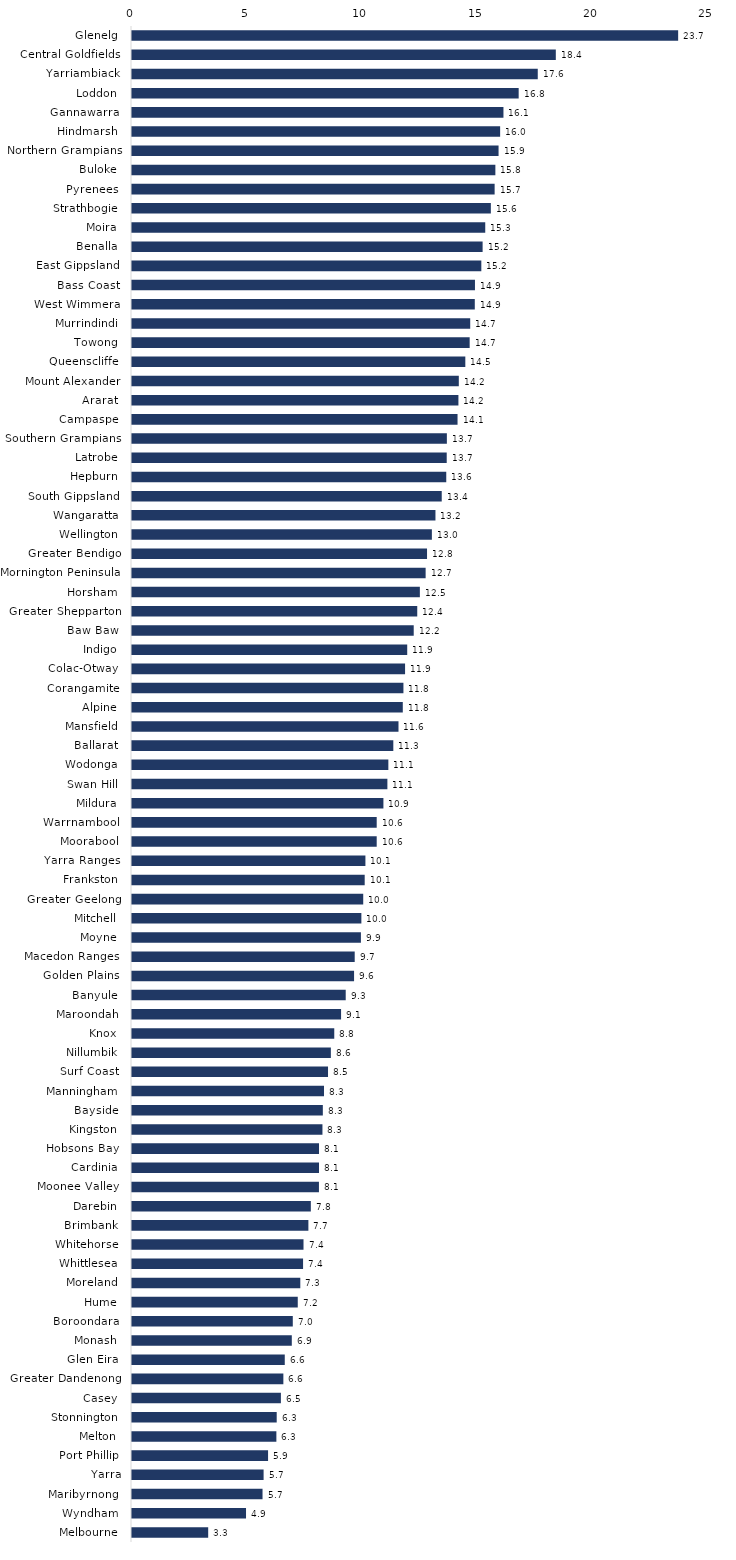
| Category | Series 0 |
|---|---|
| Glenelg  | 23.705 |
| Central Goldfields  | 18.395 |
| Yarriambiack  | 17.611 |
| Loddon  | 16.783 |
| Gannawarra  | 16.122 |
| Hindmarsh  | 15.978 |
| Northern Grampians  | 15.91 |
| Buloke  | 15.771 |
| Pyrenees  | 15.739 |
| Strathbogie  | 15.575 |
| Moira  | 15.332 |
| Benalla  | 15.218 |
| East Gippsland  | 15.162 |
| Bass Coast  | 14.886 |
| West Wimmera  | 14.878 |
| Murrindindi  | 14.68 |
| Towong  | 14.656 |
| Queenscliffe  | 14.467 |
| Mount Alexander  | 14.184 |
| Ararat  | 14.168 |
| Campaspe  | 14.129 |
| Southern Grampians  | 13.666 |
| Latrobe  | 13.66 |
| Hepburn  | 13.64 |
| South Gippsland  | 13.443 |
| Wangaratta  | 13.171 |
| Wellington  | 13.015 |
| Greater Bendigo  | 12.805 |
| Mornington Peninsula  | 12.744 |
| Horsham  | 12.494 |
| Greater Shepparton  | 12.381 |
| Baw Baw  | 12.227 |
| Indigo  | 11.945 |
| Colac-Otway  | 11.852 |
| Corangamite  | 11.781 |
| Alpine  | 11.753 |
| Mansfield  | 11.567 |
| Ballarat  | 11.342 |
| Wodonga  | 11.126 |
| Swan Hill  | 11.085 |
| Mildura  | 10.912 |
| Warrnambool  | 10.621 |
| Moorabool  | 10.621 |
| Yarra Ranges  | 10.131 |
| Frankston  | 10.1 |
| Greater Geelong  | 10.036 |
| Mitchell  | 9.955 |
| Moyne  | 9.936 |
| Macedon Ranges  | 9.666 |
| Golden Plains  | 9.638 |
| Banyule  | 9.276 |
| Maroondah  | 9.074 |
| Knox  | 8.779 |
| Nillumbik  | 8.631 |
| Surf Coast  | 8.508 |
| Manningham  | 8.334 |
| Bayside  | 8.283 |
| Kingston  | 8.266 |
| Hobsons Bay  | 8.117 |
| Cardinia  | 8.116 |
| Moonee Valley  | 8.114 |
| Darebin  | 7.762 |
| Brimbank  | 7.656 |
| Whitehorse  | 7.444 |
| Whittlesea  | 7.425 |
| Moreland  | 7.304 |
| Hume  | 7.194 |
| Boroondara  | 6.979 |
| Monash  | 6.936 |
| Glen Eira  | 6.631 |
| Greater Dandenong  | 6.57 |
| Casey  | 6.462 |
| Stonnington  | 6.281 |
| Melton  | 6.266 |
| Port Phillip  | 5.906 |
| Yarra | 5.712 |
| Maribyrnong  | 5.665 |
| Wyndham  | 4.949 |
| Melbourne  | 3.307 |